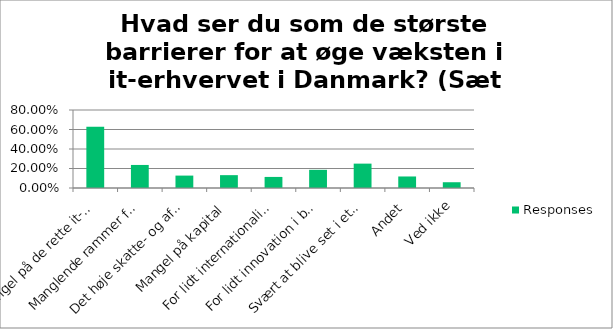
| Category | Responses |
|---|---|
| Mangel på de rette it-kompetencer | 0.627 |
| Manglende rammer for/efterspørgsel efter innovative løsninger | 0.236 |
| Det høje skatte- og afgiftsniveau i Danmark | 0.127 |
| Mangel på kapital | 0.132 |
| For lidt internationalisering/eksport i branchen | 0.114 |
| For lidt innovation i branchen | 0.186 |
| Svært at blive set i et marked med mange spillere | 0.25 |
| Andet | 0.118 |
| Ved ikke | 0.059 |